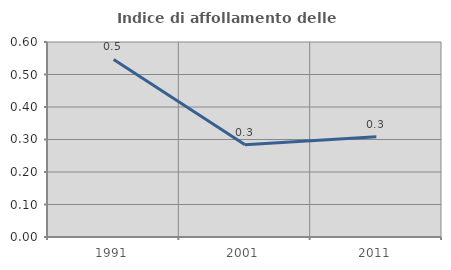
| Category | Indice di affollamento delle abitazioni  |
|---|---|
| 1991.0 | 0.546 |
| 2001.0 | 0.284 |
| 2011.0 | 0.309 |